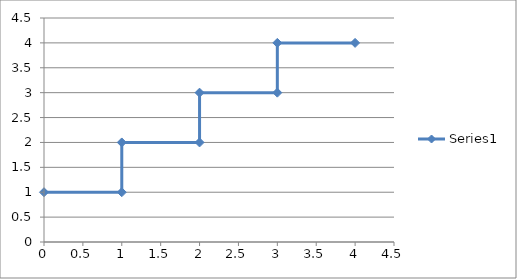
| Category | Series 0 |
|---|---|
| 0.0 | 1 |
| 1.0 | 1 |
| 1.0 | 2 |
| 2.0 | 2 |
| 2.0 | 3 |
| 3.0 | 3 |
| 3.0 | 4 |
| 4.0 | 4 |